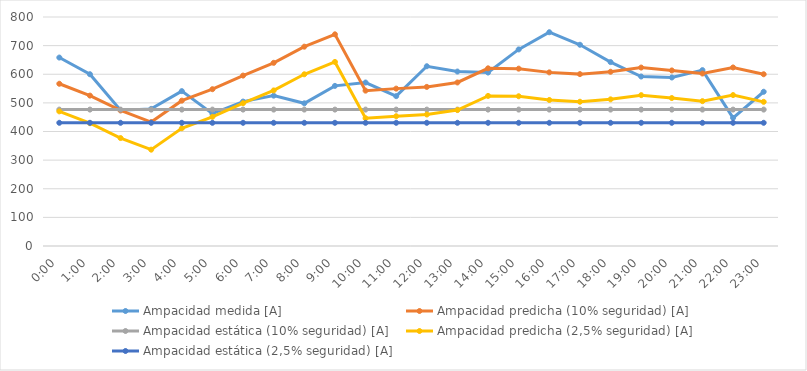
| Category | Ampacidad medida [A] | Ampacidad predicha (10% seguridad) [A] | Ampacidad estática (10% seguridad) [A] | Ampacidad predicha (2,5% seguridad) [A] | Ampacidad estática (2,5% seguridad) [A] |
|---|---|---|---|---|---|
| 0.0 | 658.317 | 566.78 | 476.5 | 470.347 | 430.4 |
| 0.041666666666666664 | 600.048 | 525.429 | 476.5 | 428.995 | 430.4 |
| 0.08333333333333333 | 474.538 | 473.533 | 476.5 | 377.099 | 430.4 |
| 0.125 | 479.035 | 432.96 | 476.5 | 336.526 | 430.4 |
| 0.166666666666667 | 541.054 | 507.772 | 476.5 | 411.338 | 430.4 |
| 0.208333333333333 | 462.332 | 547.791 | 476.5 | 451.357 | 430.4 |
| 0.25 | 504.513 | 595.327 | 476.5 | 498.893 | 430.4 |
| 0.291666666666667 | 525.253 | 639.911 | 476.5 | 543.477 | 430.4 |
| 0.333333333333333 | 498.432 | 696.334 | 476.5 | 599.9 | 430.4 |
| 0.375 | 559.36 | 739.495 | 476.5 | 643.061 | 430.4 |
| 0.416666666666667 | 571.101 | 542.758 | 476.5 | 446.324 | 430.4 |
| 0.458333333333333 | 523.529 | 549.777 | 476.5 | 453.343 | 430.4 |
| 0.5 | 627.965 | 555.824 | 476.5 | 459.39 | 430.4 |
| 0.541666666666667 | 609.439 | 571.319 | 476.5 | 474.885 | 430.4 |
| 0.583333333333333 | 605.962 | 620.717 | 476.5 | 524.283 | 430.4 |
| 0.625 | 686.722 | 619.57 | 476.5 | 523.137 | 430.4 |
| 0.666666666666667 | 746.809 | 606.541 | 476.5 | 510.107 | 430.4 |
| 0.708333333333333 | 703.05 | 600.445 | 476.5 | 504.011 | 430.4 |
| 0.75 | 642.514 | 608.732 | 476.5 | 512.298 | 430.4 |
| 0.791666666666667 | 592.083 | 623.392 | 476.5 | 526.959 | 430.4 |
| 0.833333333333333 | 588.632 | 613.305 | 476.5 | 516.872 | 430.4 |
| 0.875 | 614.411 | 602.489 | 476.5 | 506.056 | 430.4 |
| 0.916666666666667 | 447.571 | 623.691 | 476.5 | 527.257 | 430.4 |
| 0.958333333333333 | 538.831 | 600.039 | 476.5 | 503.605 | 430.4 |